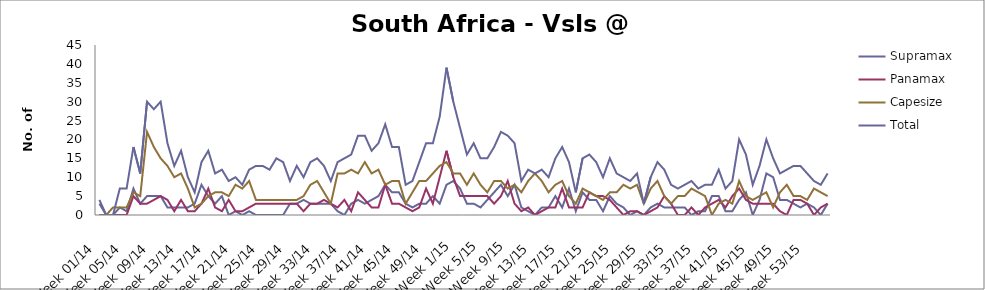
| Category | Supramax | Panamax | Capesize | Total |
|---|---|---|---|---|
| Week 01/14 | 3 | 0 | 0 | 4 |
| Week 02/14 | 0 | 0 | 0 | 0 |
| Week 03/14 | 0 | 0 | 2 | 0 |
| Week 04/14 | 2 | 0 | 2 | 7 |
| Week 05/14 | 1 | 0 | 2 | 7 |
| Week 06/14 | 7 | 5 | 6 | 18 |
| Week 07/14 | 3 | 3 | 5 | 11 |
| Week 08/14 | 5 | 3 | 22 | 30 |
| Week 09/14 | 5 | 4 | 18 | 28 |
| Week 10/14 | 5 | 5 | 15 | 30 |
| Week 11/14 | 2 | 4 | 13 | 19 |
| Week 12/14 | 2 | 1 | 10 | 13 |
| Week 13/14 | 2 | 4 | 11 | 17 |
| Week 14/14 | 2 | 1 | 7 | 10 |
| Week 15/14 | 3 | 1 | 2 | 6 |
| Week 16/14 | 8 | 3 | 3 | 14 |
| Week 17/14 | 5 | 7 | 5 | 17 |
| Week 18/14 | 3 | 2 | 6 | 11 |
| Week 19/14 | 5 | 1 | 6 | 12 |
| Week 20/14 | 0 | 4 | 5 | 9 |
| Week 21/14 | 1 | 1 | 8 | 10 |
| Week 22/14 | 0 | 1 | 7 | 8 |
| Week 23/14 | 1 | 2 | 9 | 12 |
| Week 24/14 | 0 | 3 | 4 | 13 |
| Week 25/14 | 0 | 3 | 4 | 13 |
| Week 26/14 | 0 | 3 | 4 | 12 |
| Week 27/14 | 0 | 3 | 4 | 15 |
| Week 28/14 | 0 | 3 | 4 | 14 |
| Week 29/14 | 3 | 3 | 4 | 9 |
| Week 30/14 | 3 | 3 | 4 | 13 |
| Week 31/14 | 4 | 1 | 5 | 10 |
| Week 32/14 | 3 | 3 | 8 | 14 |
| Week 33/14 | 3 | 3 | 9 | 15 |
| Week 34/14 | 3 | 4 | 6 | 13 |
| Week 35/14 | 3 | 3 | 3 | 9 |
| Week 36/14 | 1 | 2 | 11 | 14 |
| Week 37/14 | 0 | 4 | 11 | 15 |
| Week 38/14 | 3 | 1 | 12 | 16 |
| Week 39/14 | 4 | 6 | 11 | 21 |
| Week 40/14 | 3 | 4 | 14 | 21 |
| Week 41/14 | 4 | 2 | 11 | 17 |
| Week 42/14 | 5 | 2 | 12 | 19 |
| Week 43/14 | 8 | 8 | 8 | 24 |
| Week 44/14 | 6 | 3 | 9 | 18 |
| Week 45/14 | 6 | 3 | 9 | 18 |
| Week 46/14 | 3 | 2 | 3 | 8 |
| Week 47/14 | 2 | 1 | 6 | 9 |
| Week 48/14 | 3 | 2 | 9 | 14 |
| Week 49/14 | 3 | 7 | 9 | 19 |
| Week 50/14 | 5 | 3 | 11 | 19 |
| Week 51/14 | 3 | 10 | 13 | 26 |
| Week 52/14 | 8 | 17 | 14 | 39 |
| Week 1/15 | 9 | 10 | 11 | 30 |
| Week 2/15 | 7 | 5 | 11 | 23 |
| Week 3/15 | 3 | 5 | 8 | 16 |
| Week 4/15 | 3 | 5 | 11 | 19 |
| Week 5/15 | 2 | 5 | 8 | 15 |
| Week 6/15 | 4 | 5 | 6 | 15 |
| Week 7/15 | 6 | 3 | 9 | 18 |
| Week 8/15 | 8 | 5 | 9 | 22 |
| Week 9/15 | 5 | 9 | 7 | 21 |
| Week 10/15 | 8 | 3 | 8 | 19 |
| Week 11/15 | 2 | 1 | 6 | 9 |
| Week 12/15 | 1 | 2 | 9 | 12 |
| Week 13/15 | 0 | 0 | 11 | 11 |
| Week 14/15 | 2 | 1 | 9 | 12 |
| Week 15/15 | 2 | 2 | 6 | 10 |
| Week 16/15 | 5 | 2 | 8 | 15 |
| Week 17/15 | 2 | 7 | 9 | 18 |
| Week 18/15 | 7 | 2 | 5 | 14 |
| Week 19/15 | 1 | 2 | 3 | 6 |
| Week 20/15 | 6 | 2 | 7 | 15 |
| Week 21/15 | 4 | 6 | 6 | 16 |
| Week 22/15 | 4 | 5 | 5 | 14 |
| Week 23/15 | 1 | 5 | 4 | 10 |
| Week 24/15 | 5 | 4 | 6 | 15 |
| Week 25/15 | 3 | 2 | 6 | 11 |
| Week 26/15 | 2 | 0 | 8 | 10 |
| Week 27/15 | 0 | 1 | 7 | 9 |
| Week 28/15 | 1 | 1 | 8 | 11 |
| Week 29/15 | 0 | 0 | 3 | 3 |
| Week 30/15 | 2 | 1 | 7 | 10 |
| Week 31/15 | 3 | 2 | 9 | 14 |
| Week 32/15 | 2 | 5 | 5 | 12 |
| Week 33/15 | 2 | 3 | 3 | 8 |
| Week 34/15 | 2 | 0 | 5 | 7 |
| Week 35/15 | 2 | 0 | 5 | 8 |
| Week 36/15 | 0 | 2 | 7 | 9 |
| Week 37/15 | 1 | 0 | 6 | 7 |
| Week 38/15 | 1 | 2 | 5 | 8 |
| Week 39/15 | 5 | 3 | 0 | 8 |
| Week 40/15 | 5 | 4 | 3 | 12 |
| Week 41/15 | 1 | 2 | 4 | 7 |
| Week 42/15 | 1 | 5 | 3 | 9 |
| Week 43/15 | 4 | 7 | 9 | 20 |
| Week 44/15 | 6 | 4 | 5 | 16 |
| Week 45/15 | 0 | 3 | 4 | 8 |
| Week 46/15 | 4 | 3 | 5 | 13 |
| Week 47/15 | 11 | 3 | 6 | 20 |
| Week 48/15 | 10 | 3 | 2 | 15 |
| Week 49/15 | 4 | 1 | 6 | 11 |
| Week 50/15 | 4 | 0 | 8 | 12 |
| Week 51/15 | 3 | 4 | 5 | 13 |
| Week 52/15 | 2 | 4 | 5 | 13 |
| Week 53/15 | 3 | 3 | 4 | 11 |
| Week 01/16 | 2 | 0 | 7 | 9 |
| Week 02/16 | 0 | 2 | 6 | 8 |
| Week 03/16 | 3 | 3 | 5 | 11 |